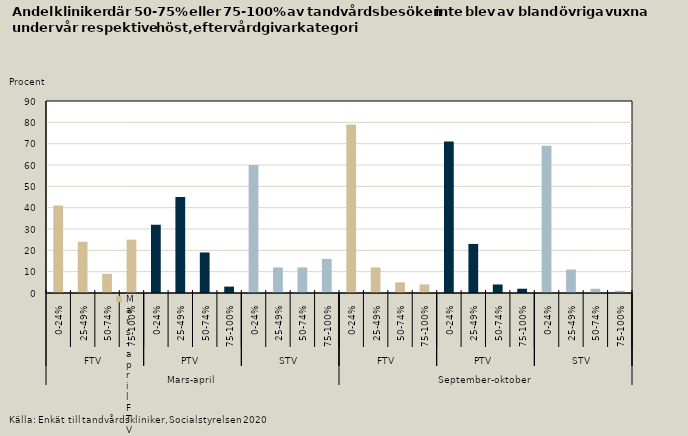
| Category | Övriga vuxna |
|---|---|
| 0 | 41 |
| 1 | 24 |
| 2 | 9 |
| 3 | 25 |
| 4 | 32 |
| 5 | 45 |
| 6 | 19 |
| 7 | 3 |
| 8 | 60 |
| 9 | 12 |
| 10 | 12 |
| 11 | 16 |
| 12 | 79 |
| 13 | 12 |
| 14 | 5 |
| 15 | 4 |
| 16 | 71 |
| 17 | 23 |
| 18 | 4 |
| 19 | 2 |
| 20 | 69 |
| 21 | 11 |
| 22 | 2 |
| 23 | 1 |